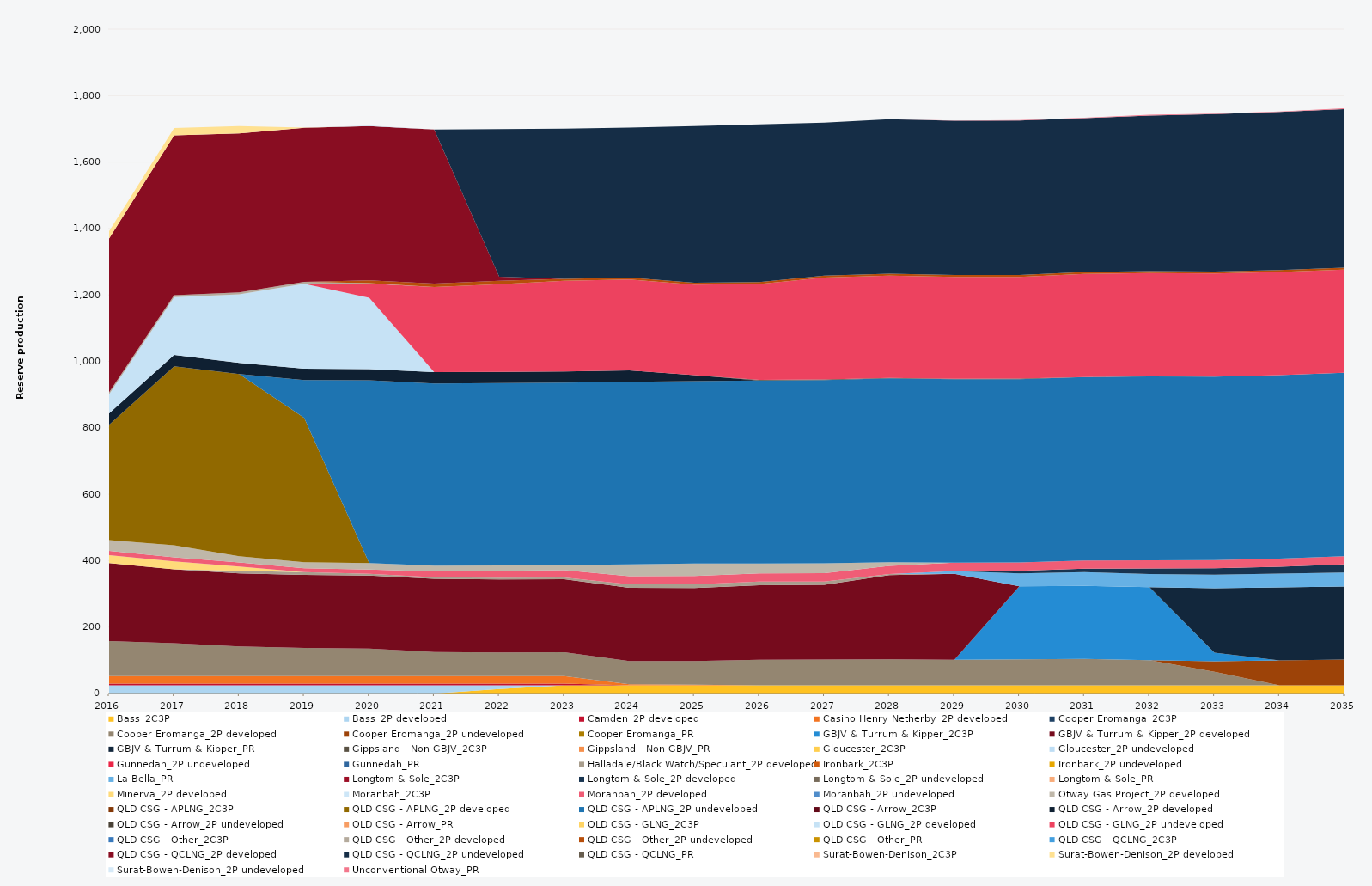
| Category | Bass_2C3P | Bass_2P developed | Camden_2P developed | Casino Henry Netherby_2P developed | Cooper Eromanga_2C3P | Cooper Eromanga_2P developed | Cooper Eromanga_2P undeveloped | Cooper Eromanga_PR | GBJV & Turrum & Kipper_2C3P | GBJV & Turrum & Kipper_2P developed | GBJV & Turrum & Kipper_PR | Gippsland - Non GBJV_2C3P | Gippsland - Non GBJV_PR | Gloucester_2C3P | Gloucester_2P undeveloped | Gunnedah_2P undeveloped | Gunnedah_PR | Halladale/Black Watch/Speculant_2P developed | Ironbark_2C3P | Ironbark_2P undeveloped | La Bella_PR | Longtom & Sole_2C3P | Longtom & Sole_2P developed | Longtom & Sole_2P undeveloped | Longtom & Sole_PR | Minerva_2P developed | Moranbah_2C3P | Moranbah_2P developed | Moranbah_2P undeveloped | Otway Gas Project_2P developed | QLD CSG - APLNG_2C3P | QLD CSG - APLNG_2P developed | QLD CSG - APLNG_2P undeveloped | QLD CSG - Arrow_2C3P | QLD CSG - Arrow_2P developed | QLD CSG - Arrow_2P undeveloped | QLD CSG - Arrow_PR | QLD CSG - GLNG_2C3P | QLD CSG - GLNG_2P developed | QLD CSG - GLNG_2P undeveloped | QLD CSG - Other_2C3P | QLD CSG - Other_2P developed | QLD CSG - Other_2P undeveloped | QLD CSG - Other_PR | QLD CSG - QCLNG_2C3P | QLD CSG - QCLNG_2P developed | QLD CSG - QCLNG_2P undeveloped | QLD CSG - QCLNG_PR | Surat-Bowen-Denison_2C3P | Surat-Bowen-Denison_2P developed | Surat-Bowen-Denison_2P undeveloped | Unconventional Otway_PR |
|---|---|---|---|---|---|---|---|---|---|---|---|---|---|---|---|---|---|---|---|---|---|---|---|---|---|---|---|---|---|---|---|---|---|---|---|---|---|---|---|---|---|---|---|---|---|---|---|---|---|---|---|---|
| 2016 | 0 | 24.522 | 5 | 23.12 | 0 | 105 | 0 | 0 | 0 | 235.041 | 0 | 0 | 0 | 0 | 0 | 0 | 0 | 0 | 0 | 0 | 0 | 0 | 0 | 0 | 0 | 23.79 | 0 | 12.82 | 0 | 32.597 | 0 | 347.544 | 0 | 0 | 34.038 | 0 | 0 | 0 | 57.36 | 0 | 0 | 5.856 | 0 | 0 | 0 | 463.602 | 0 | 0 | 0 | 21.957 | 0 | 0 |
| 2017 | 0 | 24.455 | 5 | 23.12 | 0 | 98.848 | 0 | 0 | 0 | 222.562 | 0 | 0 | 0 | 0 | 0 | 0 | 0 | 0 | 0 | 0 | 0 | 0 | 0 | 0 | 0 | 23.725 | 0 | 12.277 | 0 | 36.121 | 0 | 539.164 | 0 | 0 | 33.945 | 0 | 0 | 0 | 174.038 | 0 | 0 | 5.84 | 0 | 0 | 0 | 481.324 | 0 | 0 | 0 | 21.894 | 0 | 0 |
| 2018 | 0 | 24.455 | 5 | 23.12 | 0 | 89.326 | 0 | 0 | 0 | 220 | 0 | 0 | 0 | 0 | 0 | 0 | 0 | 7.35 | 0 | 0 | 0 | 0 | 0 | 0 | 0 | 13.235 | 0 | 11.828 | 0 | 19.164 | 0 | 548.138 | 0 | 0 | 33.945 | 0 | 0 | 0 | 206.03 | 0 | 0 | 5.84 | 0 | 0 | 0 | 478.815 | 0 | 0 | 0 | 21.888 | 0 | 0 |
| 2019 | 0 | 24.455 | 5 | 23.12 | 0 | 84.435 | 0 | 0 | 0 | 220 | 0 | 0 | 0 | 0 | 0 | 0 | 0 | 8.519 | 0 | 0 | 0 | 0 | 0 | 0 | 0 | 0 | 0 | 11.398 | 0 | 18.351 | 0 | 434.704 | 113.926 | 0 | 33.945 | 0 | 0 | 0 | 255.543 | 0 | 0 | 5.84 | 0 | 0 | 0 | 463.624 | 0 | 0 | 0 | 1.077 | 0 | 0 |
| 2020 | 0 | 24.522 | 5 | 23.12 | 0 | 82.325 | 0 | 0 | 0 | 220 | 0 | 0 | 0 | 0 | 0 | 0 | 0 | 5.202 | 0 | 0 | 0 | 0 | 0 | 0 | 0 | 0 | 0 | 12.873 | 0 | 19.655 | 0 | 0 | 550.187 | 0 | 34.038 | 0 | 0 | 0 | 214.33 | 42.619 | 0 | 1.624 | 8.338 | 0 | 0 | 464.347 | 0 | 0 | 0 | 0 | 2 | 0 |
| 2021 | 0 | 24.455 | 5 | 23.12 | 0 | 72.52 | 0 | 0 | 0 | 220 | 0 | 0 | 0 | 0 | 0 | 0 | 0 | 4.854 | 0 | 0 | 0 | 0 | 0 | 0 | 0 | 0 | 0 | 17.642 | 0 | 17.253 | 0 | 0 | 548.827 | 0 | 33.945 | 0 | 0 | 0 | 0 | 256.33 | 0 | 0 | 10.403 | 0 | 0 | 463.267 | 0 | 0 | 0 | 0 | 0 | 0 |
| 2022 | 13.672 | 10.783 | 5 | 23.12 | 0 | 71.039 | 0 | 0 | 0 | 220 | 0 | 0 | 0 | 0 | 0 | 0 | 0 | 4.811 | 0 | 0 | 0 | 0 | 0 | 0 | 0 | 0 | 0 | 20.635 | 0 | 16.386 | 0 | 0 | 548.945 | 0 | 33.945 | 0 | 0 | 0 | 0 | 263.925 | 0 | 0 | 10.403 | 0 | 0 | 12.422 | 443.817 | 0 | 0 | 0 | 0 | 0 |
| 2023 | 24.455 | 0 | 5 | 23.12 | 0 | 71.356 | 0 | 0 | 0 | 220 | 0 | 0 | 0 | 0 | 0 | 0 | 0 | 5.269 | 0 | 0 | 0 | 0 | 0 | 0 | 0 | 0 | 0 | 22.362 | 0 | 15.537 | 0 | 0 | 548.813 | 0 | 33.945 | 0 | 0 | 0 | 0 | 272.734 | 0 | 0 | 5.84 | 0 | 0 | 0 | 451.813 | 0 | 0 | 0 | 0 | 0 |
| 2024 | 24.522 | 0 | 0 | 3.454 | 0 | 69.98 | 0 | 0 | 0 | 220 | 0 | 0 | 0 | 0 | 0 | 0 | 0 | 10.95 | 0 | 0 | 0 | 0 | 0 | 0 | 0 | 0 | 0 | 24.202 | 0 | 35.355 | 0 | 0 | 550.151 | 0 | 34.038 | 0 | 0 | 0 | 0 | 273.79 | 0 | 0 | 5.856 | 0 | 0 | 0 | 451.768 | 0 | 0 | 0 | 0 | 0 |
| 2025 | 24.455 | 0 | 0 | 1.846 | 0 | 71.484 | 0 | 0 | 0 | 220 | 0 | 0 | 0 | 0 | 0 | 0 | 0 | 10.95 | 0 | 0 | 0 | 0 | 0 | 0 | 0 | 0 | 0 | 24.797 | 0 | 38 | 0 | 0 | 549.074 | 0 | 18.166 | 0 | 0 | 0 | 0 | 272.097 | 0 | 0 | 5.84 | 0 | 0 | 0 | 471.452 | 0 | 0 | 0 | 0 | 0 |
| 2026 | 24.455 | 0 | 0 | 0 | 0 | 77.14 | 0 | 0 | 0 | 224.306 | 0 | 0 | 0 | 0 | 0 | 0 | 0 | 10.95 | 0 | 0 | 0 | 0 | 0 | 0 | 0 | 0 | 0 | 24.82 | 0 | 29.883 | 0 | 0 | 550.982 | 0 | 0 | 1.6 | 0 | 0 | 0 | 288.607 | 0 | 0 | 5.84 | 0 | 0 | 0 | 474.665 | 0 | 0 | 0 | 0 | 0 |
| 2027 | 24.455 | 0 | 0 | 0 | 0 | 77.527 | 0 | 0 | 0 | 225.285 | 0 | 0 | 0 | 0 | 0 | 0 | 0 | 9.895 | 0 | 0 | 0 | 0 | 0 | 0 | 0 | 0 | 0 | 24.82 | 0 | 30.182 | 0 | 0 | 551.742 | 0 | 0 | 1.6 | 0 | 0 | 0 | 306.707 | 0 | 0 | 5.84 | 0 | 0 | 0 | 460.333 | 0 | 0 | 0 | 0 | 0 |
| 2028 | 24.522 | 0 | 0 | 0 | 0 | 78.302 | 0 | 0 | 0 | 253.259 | 0 | 0 | 0 | 0 | 0 | 0 | 0 | 3.25 | 0 | 0 | 0 | 0 | 0 | 0 | 0 | 0 | 0 | 24.888 | 0 | 11.122 | 0 | 0 | 553.502 | 0 | 0 | 1.6 | 0 | 0 | 0 | 307.756 | 0 | 0 | 5.856 | 0 | 0 | 0 | 464.858 | 0 | 0 | 0 | 0 | 0 |
| 2029 | 24.455 | 0 | 0 | 0 | 0 | 77 | 0 | 0 | 0 | 258.654 | 0 | 0 | 0 | 0 | 0 | 0 | 0 | 0 | 0 | 0 | 8.874 | 0 | 0 | 0 | 0 | 0 | 0 | 24.82 | 0 | 0 | 0 | 0 | 552.226 | 0 | 0 | 1.6 | 0 | 0 | 0 | 306.707 | 0 | 0 | 5.84 | 0 | 0 | 0 | 464.338 | 0 | 0 | 0 | 0 | 0.394 |
| 2030 | 24.455 | 0 | 0 | 0 | 0 | 78.19 | 0 | 0 | 220 | 0 | 0 | 0 | 0 | 0 | 0 | 0 | 0 | 0 | 0 | 0 | 39.229 | 0 | 7.74 | 0 | 0 | 0 | 0 | 24.82 | 0 | 0 | 0 | 0 | 552.07 | 0 | 0 | 1.6 | 0 | 0 | 0 | 305.834 | 0 | 0 | 5.84 | 0 | 0 | 0 | 465.117 | 0 | 0 | 0 | 0 | 1.355 |
| 2031 | 24.455 | 0 | 0 | 0 | 0 | 79.894 | 0 | 0 | 220 | 0 | 0 | 0 | 0 | 0 | 0 | 0 | 0 | 0 | 0 | 0 | 41.19 | 0 | 10.074 | 0 | 0 | 0 | 0 | 24.82 | 0 | 0 | 0 | 0 | 552.236 | 0 | 0 | 0.395 | 0 | 0 | 0 | 309.944 | 0 | 0 | 5.84 | 0 | 0 | 0 | 463.39 | 0 | 0.01 | 0 | 0 | 1.225 |
| 2032 | 24.522 | 0 | 0 | 0 | 0 | 75.853 | 0 | 0 | 220 | 0 | 0 | 0 | 0 | 0 | 0 | 0 | 0 | 0 | 0 | 0 | 39.238 | 0 | 16.732 | 0 | 0 | 0 | 0 | 24.888 | 0 | 0 | 0 | 0 | 553.758 | 0 | 0 | 0.205 | 0 | 0 | 0 | 310.873 | 0 | 0 | 5.856 | 0 | 0 | 0 | 468.252 | 0 | 0 | 0 | 0 | 2.217 |
| 2033 | 24.455 | 0 | 0 | 0 | 0 | 40.782 | 32.025 | 0 | 25.714 | 0 | 194.286 | 0 | 0 | 0 | 0 | 0 | 0 | 0 | 0 | 0 | 40.547 | 0 | 19.136 | 0 | 0 | 0 | 0 | 24.82 | 0 | 0 | 0 | 0 | 552.245 | 0 | 0 | 0.19 | 0 | 0 | 0 | 310.199 | 0 | 0 | 5.84 | 0 | 0 | 0 | 473.96 | 0 | 0 | 0 | 0 | 1.57 |
| 2034 | 24.455 | 0 | 0 | 0 | 0 | 0 | 75.152 | 0 | 0 | 0 | 220 | 0 | 0 | 0 | 0 | 0 | 0 | 0 | 0 | 0 | 41.366 | 0 | 20.354 | 0 | 0 | 0 | 0 | 24.82 | 0 | 0 | 0 | 0 | 552.245 | 0 | 0 | 0.261 | 0 | 0 | 0 | 310.24 | 0 | 0 | 5.84 | 0 | 0 | 0 | 476.114 | 0 | 0 | 0 | 0 | 1.483 |
| 2035 | 24.455 | 0 | 0 | 0 | 0 | 0 | 77.951 | 0 | 0 | 0 | 220 | 0 | 0 | 0 | 0 | 0 | 0 | 0 | 0 | 0 | 41.821 | 0 | 24.374 | 0 | 0 | 0 | 0 | 24.82 | 0 | 0 | 0 | 0 | 552.245 | 0 | 0 | 0.36 | 0 | 0 | 0 | 310.36 | 0 | 0 | 5.84 | 0 | 0 | 0 | 477.274 | 0 | 0 | 0 | 0 | 2.755 |